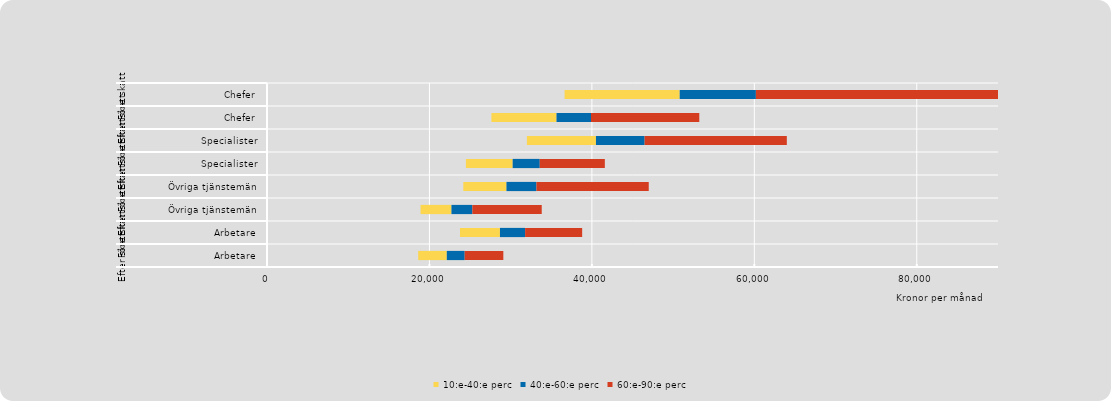
| Category | Series 0 | 10:e-40:e perc | 40:e-60:e perc | 60:e-90:e perc |
|---|---|---|---|---|
| 0 | 18615 | 3522 | 2201 | 4759 |
| 1 | 23762 | 4919 | 3097 | 7025 |
| 2 | 18907 | 3803 | 2573 | 8542 |
| 3 | 24170 | 5312 | 3691 | 13827 |
| 4 | 24489 | 5757 | 3336 | 8012 |
| 5 | 32000 | 8500 | 5991 | 17509 |
| 6 | 27632 | 8013 | 4246 | 13333 |
| 7 | 36641 | 14172 | 9379 | 29808 |